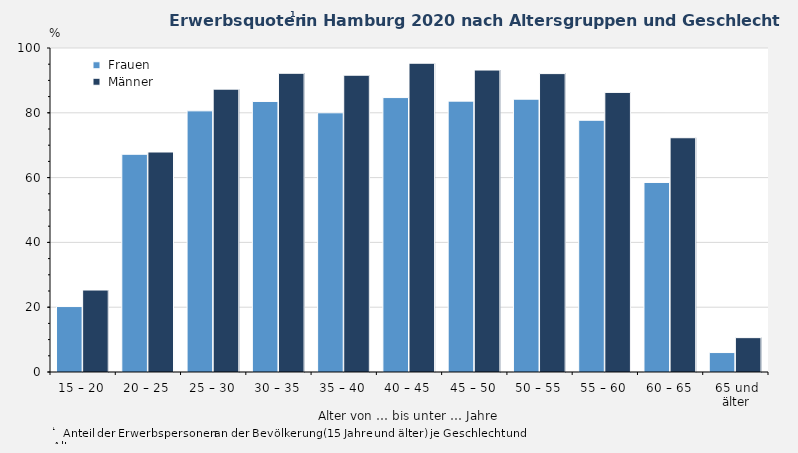
| Category |  Frauen |  Männer |
|---|---|---|
| 15 – 20 | 20.2 | 25.3 |
| 20 – 25 | 67.2 | 67.9 |
| 25 – 30 | 80.6 | 87.3 |
| 30 – 35 | 83.5 | 92.2 |
| 35 – 40 | 80 | 91.6 |
| 40 – 45 | 84.7 | 95.3 |
| 45 – 50 | 83.6 | 93.2 |
| 50 – 55 | 84.2 | 92.1 |
| 55 – 60 | 77.7 | 86.3 |
| 60 – 65 | 58.5 | 72.3 |
| 65 und älter | 6 | 10.6 |